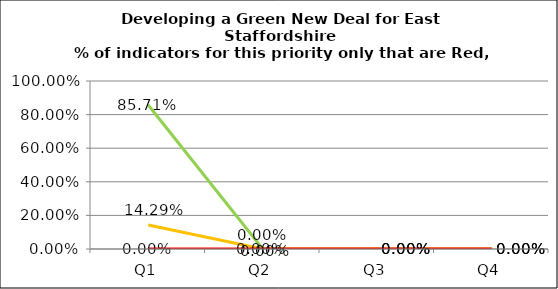
| Category | Green | Amber | Red |
|---|---|---|---|
| Q1 | 0.857 | 0.143 | 0 |
| Q2 | 0 | 0 | 0 |
| Q3 | 0 | 0 | 0 |
| Q4 | 0 | 0 | 0 |